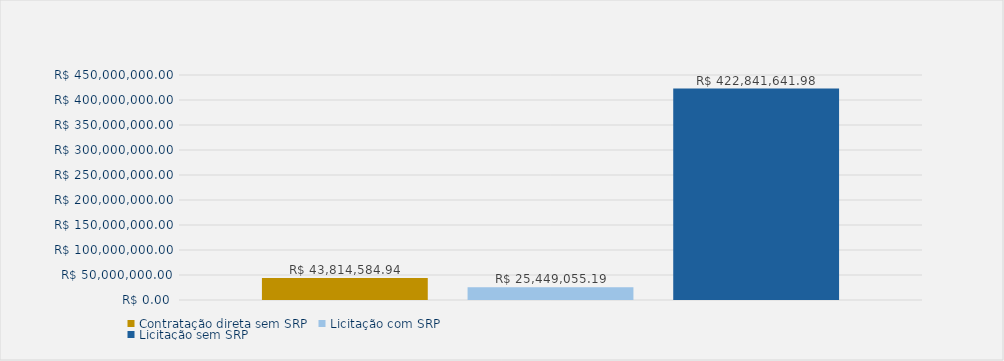
| Category | Contratação direta sem SRP | Licitação com SRP | Licitação sem SRP |
|---|---|---|---|
| Total | 43814584.94 | 25449055.19 | 422841641.98 |